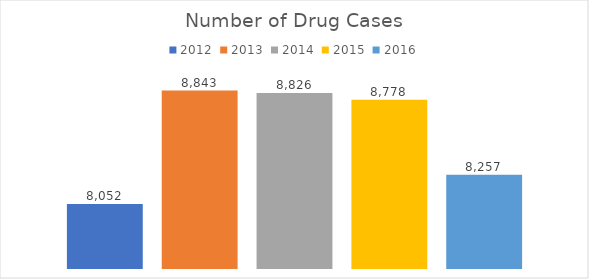
| Category | 2012 | 2013 | 2014 | 2015 | 2016 |
|---|---|---|---|---|---|
| 0 | 8052 | 8843 | 8826 | 8778 | 8257 |